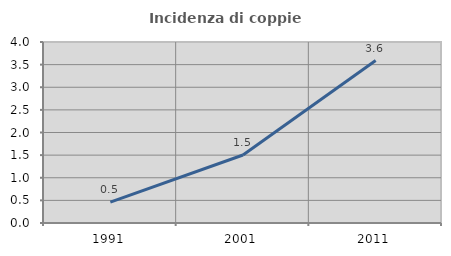
| Category | Incidenza di coppie miste |
|---|---|
| 1991.0 | 0.462 |
| 2001.0 | 1.503 |
| 2011.0 | 3.591 |